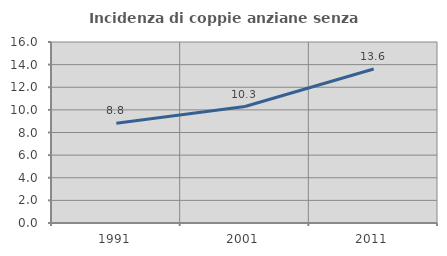
| Category | Incidenza di coppie anziane senza figli  |
|---|---|
| 1991.0 | 8.822 |
| 2001.0 | 10.295 |
| 2011.0 | 13.615 |